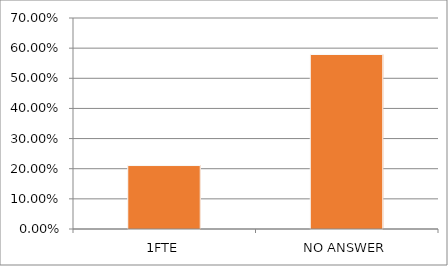
| Category | Series 0 |
|---|---|
| 1FTE | 0.211 |
| NO ANSWER | 0.579 |